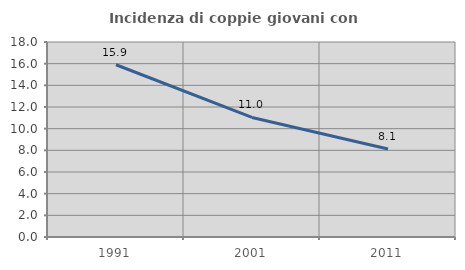
| Category | Incidenza di coppie giovani con figli |
|---|---|
| 1991.0 | 15.9 |
| 2001.0 | 11.035 |
| 2011.0 | 8.126 |